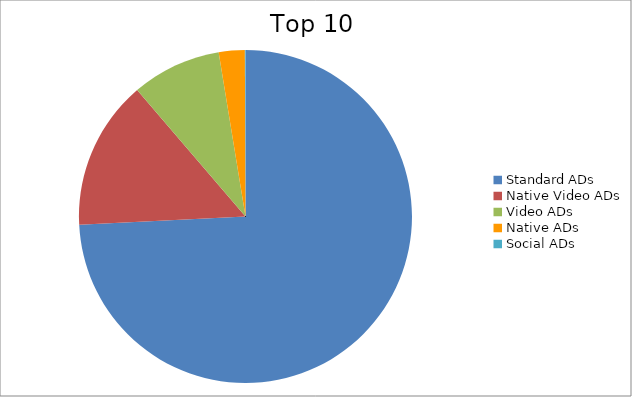
| Category | Series 0 |
|---|---|
| Standard ADs | 74.2 |
| Native Video ADs | 14.52 |
| Video ADs | 8.7 |
| Native ADs | 2.52 |
| Social ADs | 0.06 |